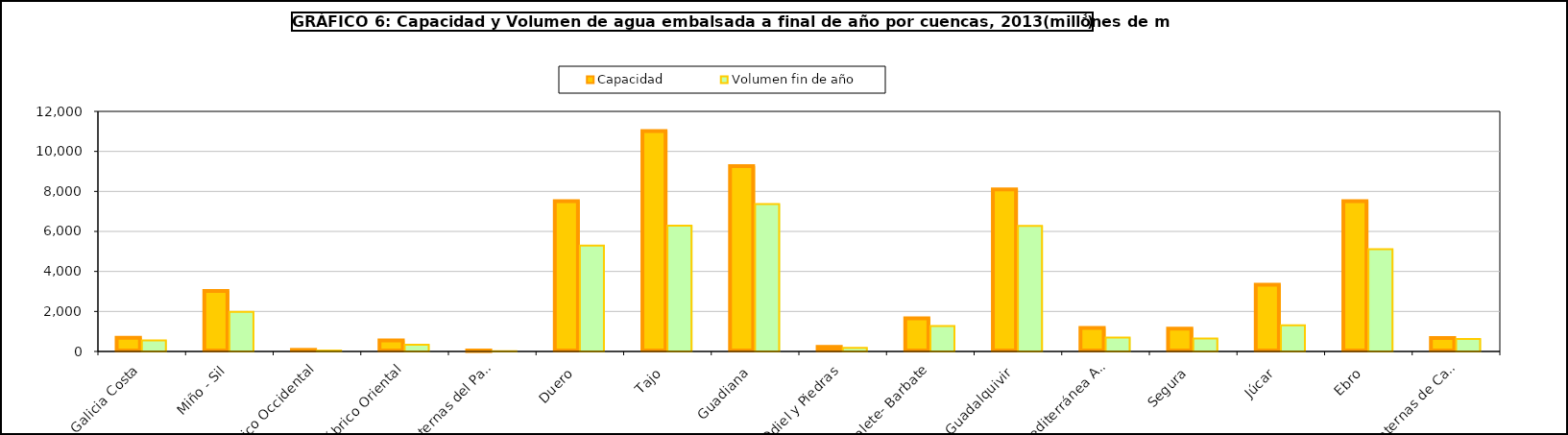
| Category | Capacidad | Volumen fin de año |
|---|---|---|
| Galicia Costa | 684 | 549 |
| Miño - Sil | 3030 | 1986 |
| Cantábrico Occidental | 79 | 45 |
| Cantábrico Oriental | 554 | 333 |
| Cuencas Internas del País Vasco | 21 | 13 |
| Duero  | 7507 | 5295 |
| Tajo  | 11012 | 6292 |
| Guadiana  | 9266 | 7366 |
| Tinto, Odiel y Piedras | 229 | 185 |
| Guadalete- Barbate | 1651 | 1273 |
| Guadalquivir  | 8101 | 6278 |
| Cuenca Mediterránea Andaluza | 1177 | 696 |
| Segura  | 1141 | 643 |
| Júcar  | 3337 | 1310 |
| Ebro  | 7511 | 5110 |
| Cuencas internas de Cataluña | 677 | 619 |